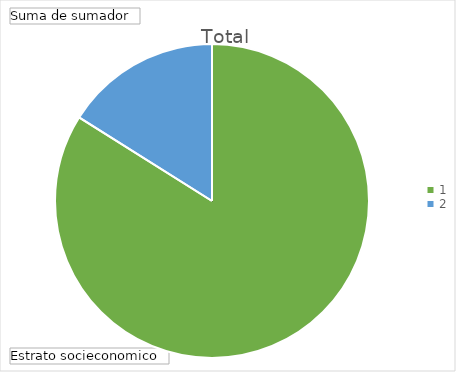
| Category | Total |
|---|---|
| 1 | 1034 |
| 2 | 198 |